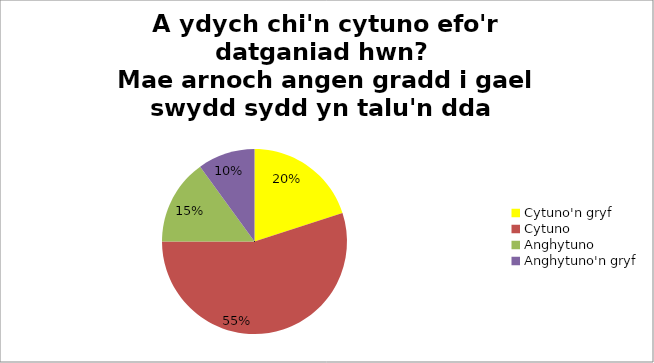
| Category | Series 0 |
|---|---|
| Cytuno'n gryf  | 4 |
| Cytuno  | 11 |
| Anghytuno  | 3 |
| Anghytuno'n gryf  | 2 |